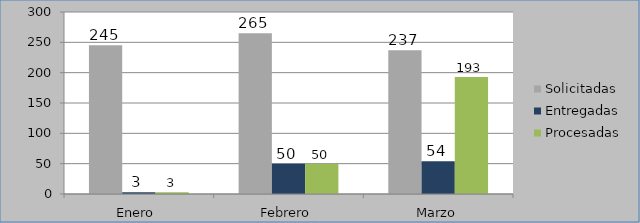
| Category | Solicitadas | Entregadas | Procesadas |
|---|---|---|---|
| Enero  | 245 | 3 | 3 |
| Febrero | 265 | 50 | 50 |
| Marzo | 237 | 54 | 193 |